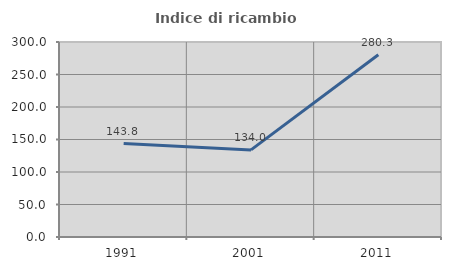
| Category | Indice di ricambio occupazionale  |
|---|---|
| 1991.0 | 143.777 |
| 2001.0 | 134 |
| 2011.0 | 280.347 |